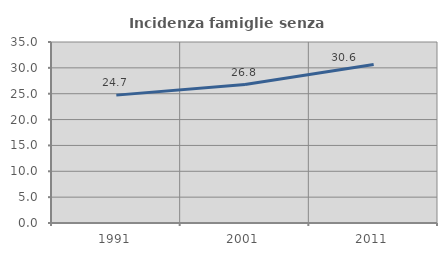
| Category | Incidenza famiglie senza nuclei |
|---|---|
| 1991.0 | 24.727 |
| 2001.0 | 26.771 |
| 2011.0 | 30.629 |